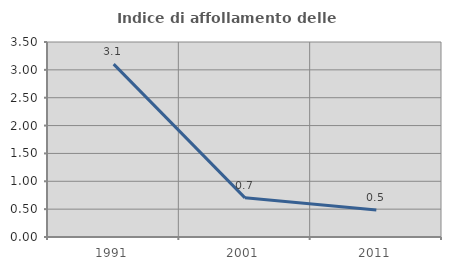
| Category | Indice di affollamento delle abitazioni  |
|---|---|
| 1991.0 | 3.103 |
| 2001.0 | 0.703 |
| 2011.0 | 0.484 |